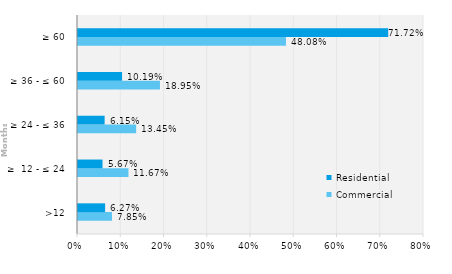
| Category | Commercial | Residential |
|---|---|---|
| >12 | 0.079 | 0.063 |
| ≥  12 - ≤ 24 | 0.117 | 0.057 |
| ≥ 24 - ≤ 36 | 0.134 | 0.062 |
| ≥ 36 - ≤ 60 | 0.189 | 0.102 |
| ≥ 60 | 0.481 | 0.717 |